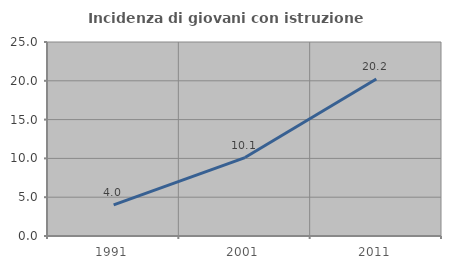
| Category | Incidenza di giovani con istruzione universitaria |
|---|---|
| 1991.0 | 4 |
| 2001.0 | 10.11 |
| 2011.0 | 20.225 |